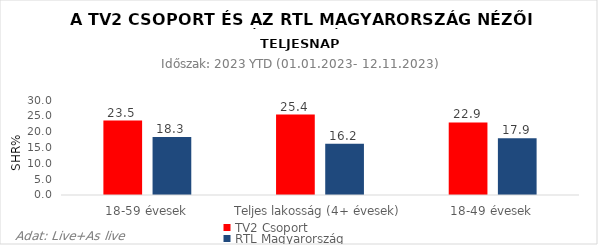
| Category | TV2 Csoport | RTL Magyarország |
|---|---|---|
| 18-59 évesek | 23.5 | 18.3 |
| Teljes lakosság (4+ évesek) | 25.4 | 16.2 |
| 18-49 évesek | 22.9 | 17.9 |